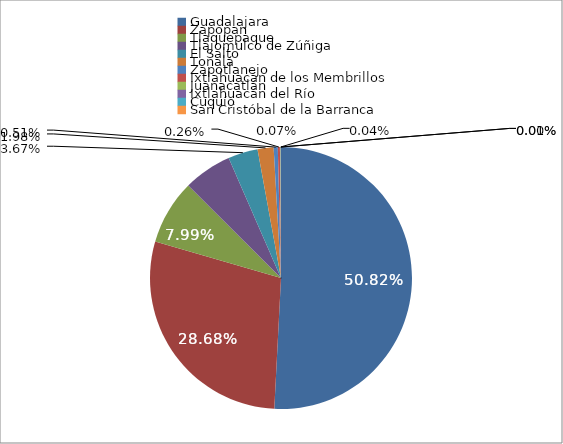
| Category | Series 0 |
|---|---|
| Guadalajara | 708523 |
| Zapopan | 399884 |
| Tlaquepaque | 111414 |
| Tlajomulco de Zúñiga | 83357 |
| El Salto | 51130 |
| Tonalá | 27528 |
| Zapotlanejo | 7077 |
| Ixtlahuacán de los Membrillos | 3623 |
| Juanacatlán | 1019 |
| Ixtlahuacán del Río | 580 |
| Cuquío | 177 |
| San Cristóbal de la Barranca | 27 |